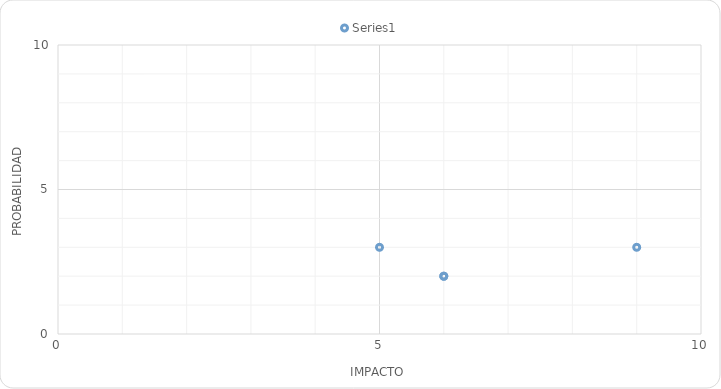
| Category | Series 0 |
|---|---|
| 5.0 | 3 |
| 6.0 | 2 |
| 6.0 | 2 |
| 9.0 | 3 |